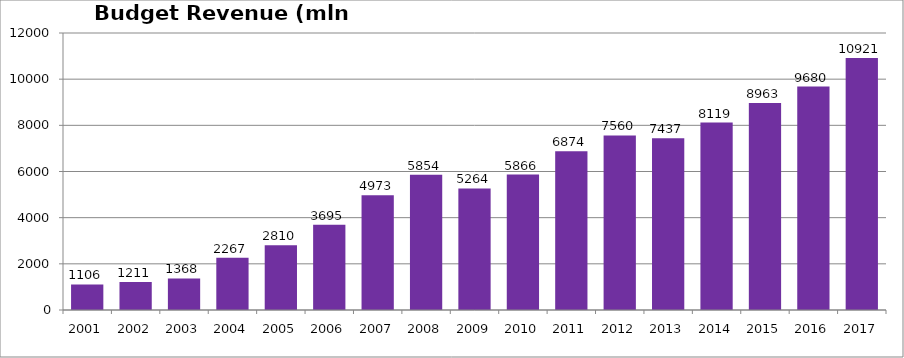
| Category | Budget Revenue (mln GEL) |
|---|---|
| 2001.0 | 1105.679 |
| 2002.0 | 1211.017 |
| 2003.0 | 1367.813 |
| 2004.0 | 2266.625 |
| 2005.0 | 2810.25 |
| 2006.0 | 3694.684 |
| 2007.0 | 4972.635 |
| 2008.0 | 5854.175 |
| 2009.0 | 5264.495 |
| 2010.0 | 5865.801 |
| 2011.0 | 6873.661 |
| 2012.0 | 7560.046 |
| 2013.0 | 7437.173 |
| 2014.0 | 8118.8 |
| 2015.0 | 8963.17 |
| 2016.0 | 9679.561 |
| 2017.0 | 10921.174 |